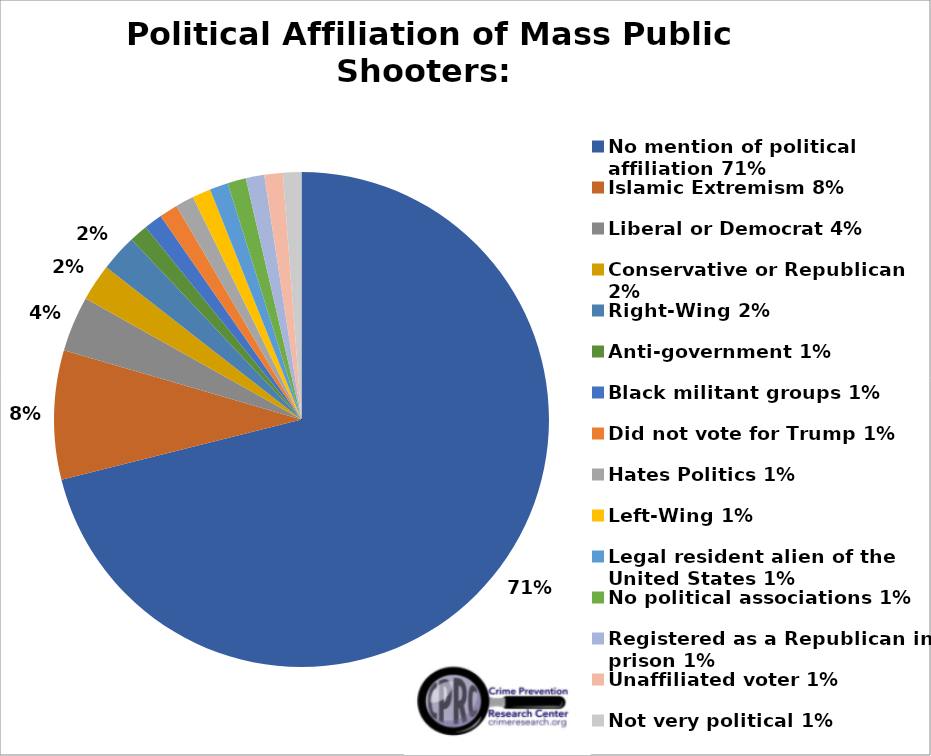
| Category | Series 0 |
|---|---|
| No mention of political affiliation 71% | 0.711 |
| Islamic Extremism 8% | 0.084 |
| Liberal or Democrat 4% | 0.036 |
| Conservative or Republican 2% | 0.024 |
| Right-Wing 2% | 0.024 |
| Anti-government 1% | 0.012 |
| Black militant groups 1% | 0.012 |
| Did not vote for Trump 1% | 0.012 |
| Hates Politics 1% | 0.012 |
| Left-Wing 1% | 0.012 |
| Legal resident alien of the United States 1% | 0.012 |
| No political associations 1% | 0.012 |
| Registered as a Republican in prison 1% | 0.012 |
| Unaffiliated voter 1% | 0.012 |
| Not very political 1% | 0.012 |